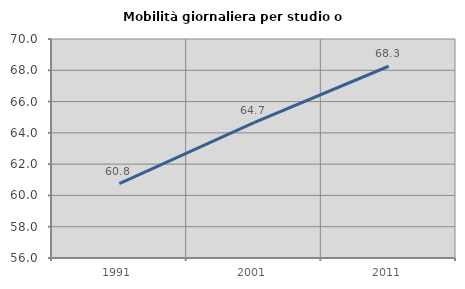
| Category | Mobilità giornaliera per studio o lavoro |
|---|---|
| 1991.0 | 60.752 |
| 2001.0 | 64.654 |
| 2011.0 | 68.258 |